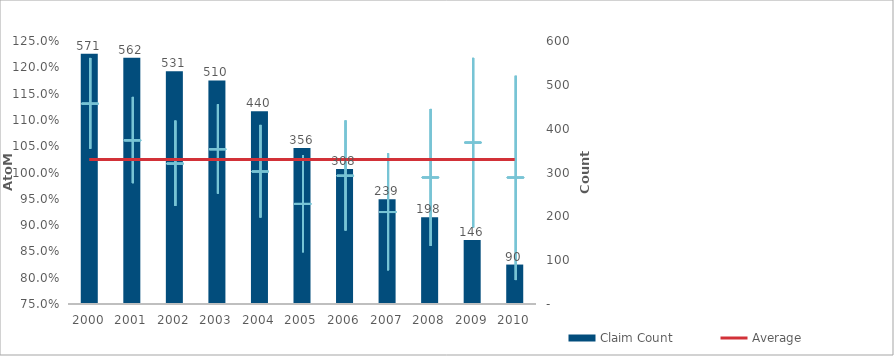
| Category | Claim Count |
|---|---|
| 0 | 571 |
| 1 | 562 |
| 2 | 531 |
| 3 | 510 |
| 4 | 440 |
| 5 | 356 |
| 6 | 308 |
| 7 | 239 |
| 8 | 198 |
| 9 | 146 |
| 10 | 90 |